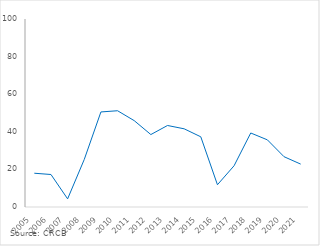
| Category | Series 0 |
|---|---|
| 2005.0 | 17.966 |
| 2006.0 | 17.283 |
| 2007.0 | 4.327 |
| 2008.0 | 25.291 |
| 2009.0 | 50.559 |
| 2010.0 | 51.197 |
| 2011.0 | 45.942 |
| 2012.0 | 38.536 |
| 2013.0 | 43.357 |
| 2014.0 | 41.59 |
| 2015.0 | 37.337 |
| 2016.0 | 11.84 |
| 2017.0 | 21.944 |
| 2018.0 | 39.363 |
| 2019.0 | 35.715 |
| 2020.0 | 26.76 |
| 2021.0 | 22.82 |